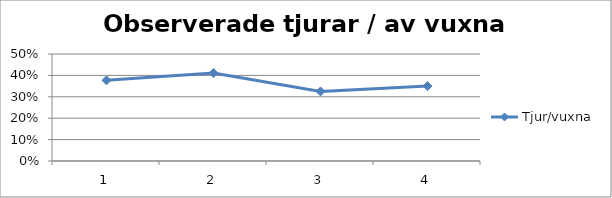
| Category | Tjur/vuxna |
|---|---|
| 0 | 0.377 |
| 1 | 0.411 |
| 2 | 0.325 |
| 3 | 0.35 |